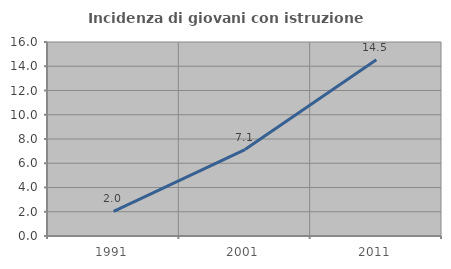
| Category | Incidenza di giovani con istruzione universitaria |
|---|---|
| 1991.0 | 2.027 |
| 2001.0 | 7.125 |
| 2011.0 | 14.542 |